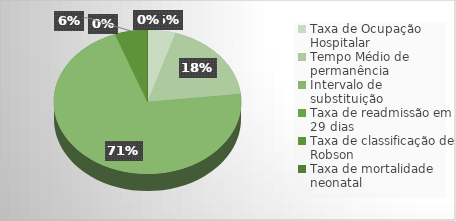
| Category | Series 0 |
|---|---|
| Taxa de Ocupação Hospitalar | 0.861 |
| Tempo Médio de permanência | 3.28 |
| Intervalo de substituição | 12.7 |
| Taxa de readmissão em 29 dias | 0 |
| Taxa de classificação de Robson | 1 |
| Taxa de mortalidade neonatal | 0 |